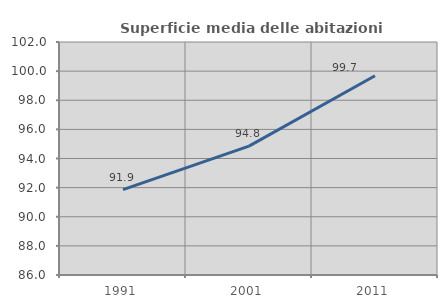
| Category | Superficie media delle abitazioni occupate |
|---|---|
| 1991.0 | 91.862 |
| 2001.0 | 94.848 |
| 2011.0 | 99.681 |